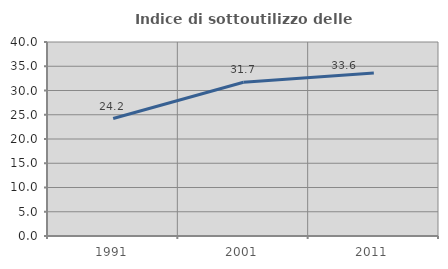
| Category | Indice di sottoutilizzo delle abitazioni  |
|---|---|
| 1991.0 | 24.223 |
| 2001.0 | 31.7 |
| 2011.0 | 33.632 |